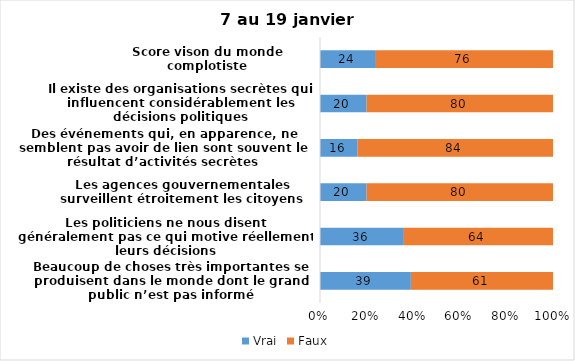
| Category | Vrai | Faux |
|---|---|---|
| Beaucoup de choses très importantes se produisent dans le monde dont le grand public n’est pas informé | 39 | 61 |
| Les politiciens ne nous disent généralement pas ce qui motive réellement leurs décisions | 36 | 64 |
| Les agences gouvernementales surveillent étroitement les citoyens | 20 | 80 |
| Des événements qui, en apparence, ne semblent pas avoir de lien sont souvent le résultat d’activités secrètes | 16 | 84 |
| Il existe des organisations secrètes qui influencent considérablement les décisions politiques | 20 | 80 |
| Score vison du monde complotiste | 24 | 76 |